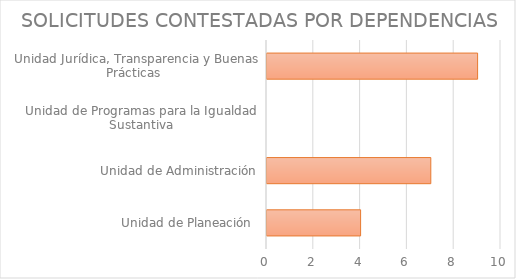
| Category | Series 1 |
|---|---|
| Unidad de Planeación  | 4 |
| Unidad de Administración | 7 |
| Unidad de Programas para la Igualdad Sustantiva | 0 |
| Unidad Jurídica, Transparencia y Buenas Prácticas  | 9 |